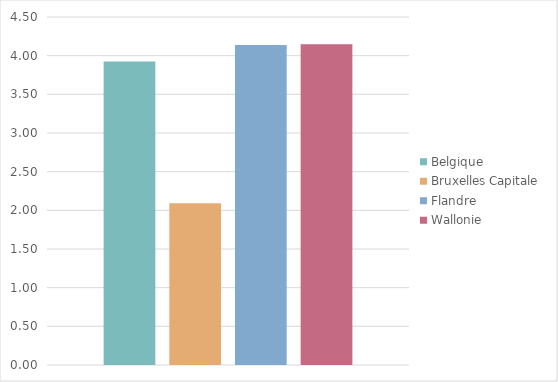
| Category | Belgique | Bruxelles Capitale | Flandre | Wallonie |
|---|---|---|---|---|
| Totaal | 3.925 | 2.093 | 4.138 | 4.148 |